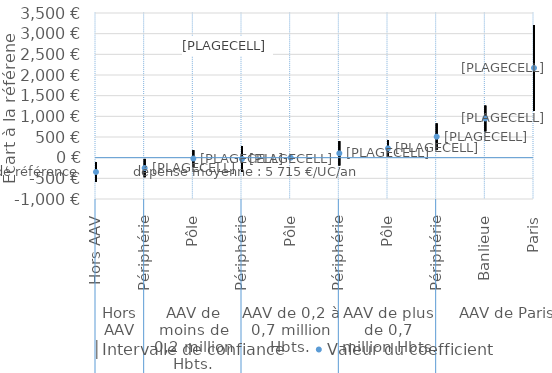
| Category | │Intervalle de confiance | Series 1 | Valeur du coefficient |
|---|---|---|---|
| 0 | -109.795 | -583.56 | -346.678 |
| 1 | -29.921 | -472.707 | -251.314 |
| 2 | 181.501 | -224.366 | -21.432 |
| 3 | 282.469 | -346.81 | -32.17 |
| 4 | 0 | 0 | 0 |
| 5 | 399.972 | -190.1 | 104.936 |
| 6 | 427.113 | 20.627 | 223.87 |
| 7 | 828.898 | 185.715 | 507.306 |
| 8 | 1260.799 | 637.019 | 948.909 |
| 9 | 3210.581 | 1131.053 | 2170.817 |